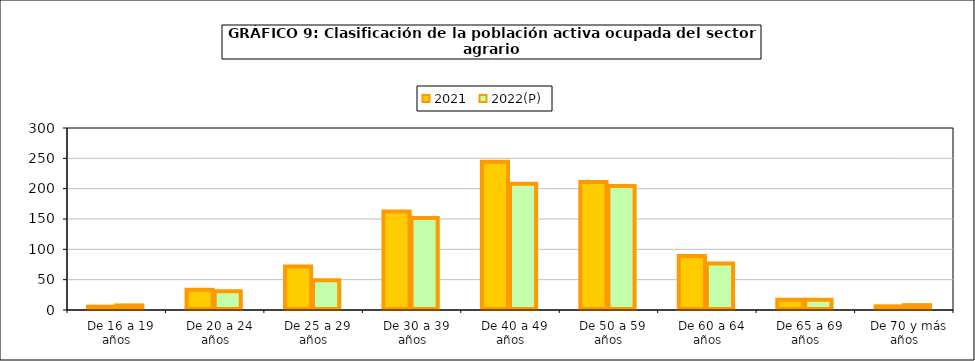
| Category | 2021 | 2022(P) |
|---|---|---|
|   De 16 a 19 años | 5.5 | 7.6 |
|   De 20 a 24 años | 33.3 | 30.8 |
|   De 25 a 29 años | 71.8 | 49 |
|   De 30 a 39 años | 162.2 | 151.7 |
|   De 40 a 49 años | 244.3 | 208.1 |
|   De 50 a 59 años | 211 | 204.3 |
|   De 60 a 64 años | 89.2 | 76.8 |
|   De 65 a 69 años | 16.8 | 16.8 |
|   De 70 y más años | 6 | 8 |